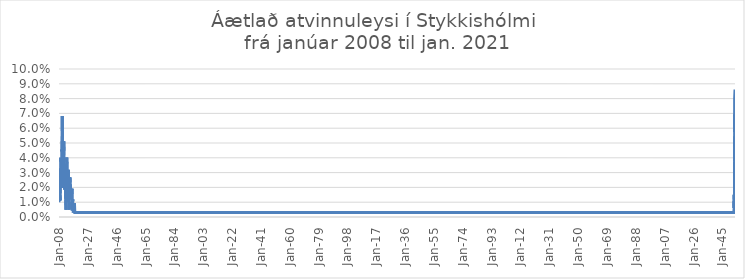
| Category | Áætlað atvinnuleysi |
|---|---|
| 2008-01-01 | 0.01 |
| 2008-02-01 | 0.015 |
| 2008-03-01 | 0.012 |
| 2008-04-01 | 0.013 |
| 2008-05-01 | 0.014 |
| 2008-06-01 | 0.011 |
| 2008-07-01 | 0.015 |
| 2008-08-01 | 0.015 |
| 2008-09-01 | 0.011 |
| 2008-10-01 | 0.012 |
| 2008-11-01 | 0.022 |
| 2008-12-01 | 0.03 |
| 2009-01-01 | 0.028 |
| 2009-02-01 | 0.033 |
| 2009-03-01 | 0.04 |
| 2009-04-01 | 0.037 |
| 2009-05-01 | 0.034 |
| 2009-06-01 | 0.032 |
| 2009-07-01 | 0.026 |
| 2009-08-01 | 0.024 |
| 2009-09-01 | 0.023 |
| 2009-10-01 | 0.035 |
| 2009-11-01 | 0.046 |
| 2009-12-01 | 0.046 |
| 2010-01-01 | 0.044 |
| 2010-02-01 | 0.055 |
| 2010-03-01 | 0.068 |
| 2010-04-01 | 0.054 |
| 2010-05-01 | 0.037 |
| 2010-06-01 | 0.02 |
| 2010-07-01 | 0.023 |
| 2010-08-01 | 0.026 |
| 2010-09-01 | 0.03 |
| 2010-10-01 | 0.025 |
| 2010-11-01 | 0.03 |
| 2010-12-01 | 0.027 |
| 2011-01-01 | 0.041 |
| 2011-02-01 | 0.043 |
| 2011-03-01 | 0.051 |
| 2011-04-01 | 0.045 |
| 2011-05-01 | 0.028 |
| 2011-06-01 | 0.033 |
| 2011-07-01 | 0.035 |
| 2011-08-01 | 0.032 |
| 2011-09-01 | 0.019 |
| 2011-10-01 | 0.033 |
| 2011-11-01 | 0.03 |
| 2011-12-01 | 0.03 |
| 2012-01-01 | 0.024 |
| 2012-02-01 | 0.026 |
| 2012-03-01 | 0.027 |
| 2012-04-01 | 0.025 |
| 2012-05-01 | 0.013 |
| 2012-06-01 | 0.011 |
| 2012-07-01 | 0.01 |
| 2012-08-01 | 0.005 |
| 2012-09-01 | 0.011 |
| 2012-10-01 | 0.02 |
| 2012-11-01 | 0.027 |
| 2012-12-01 | 0.03 |
| 2013-01-01 | 0.035 |
| 2013-02-01 | 0.039 |
| 2013-03-01 | 0.04 |
| 2013-04-01 | 0.03 |
| 2013-05-01 | 0.017 |
| 2013-06-01 | 0.016 |
| 2013-07-01 | 0.02 |
| 2013-08-01 | 0.017 |
| 2013-09-01 | 0.013 |
| 2013-10-01 | 0.01 |
| 2013-11-01 | 0.01 |
| 2013-12-01 | 0.016 |
| 2014-01-01 | 0.023 |
| 2014-02-01 | 0.025 |
| 2014-03-01 | 0.032 |
| 2014-04-01 | 0.03 |
| 2014-05-01 | 0.018 |
| 2014-06-01 | 0.012 |
| 2014-07-01 | 0.01 |
| 2014-08-01 | 0.007 |
| 2014-09-01 | 0.005 |
| 2014-10-01 | 0.01 |
| 2014-11-01 | 0.012 |
| 2014-12-01 | 0.018 |
| 2015-01-01 | 0.025 |
| 2015-02-01 | 0.023 |
| 2015-03-01 | 0.027 |
| 2015-04-01 | 0.02 |
| 2015-05-01 | 0.016 |
| 2015-06-01 | 0.02 |
| 2015-07-01 | 0.022 |
| 2015-08-01 | 0.02 |
| 2015-09-01 | 0.014 |
| 2015-10-01 | 0.014 |
| 2015-11-01 | 0.016 |
| 2015-12-01 | 0.018 |
| 2016-01-01 | 0.014 |
| 2016-02-01 | 0.019 |
| 2016-03-01 | 0.017 |
| 2016-04-01 | 0.017 |
| 2016-05-01 | 0.017 |
| 2016-06-01 | 0.016 |
| 2016-07-01 | 0.019 |
| 2016-08-01 | 0.012 |
| 2016-09-01 | 0.004 |
| 2016-10-01 | 0.006 |
| 2016-11-01 | 0.01 |
| 2016-12-01 | 0.009 |
| 2017-01-01 | 0.012 |
| 2017-02-01 | 0.01 |
| 2017-03-01 | 0.007 |
| 2017-04-01 | 0.007 |
| 2017-05-01 | 0.007 |
| 2017-06-01 | 0.003 |
| 2017-07-01 | 0.003 |
| 2017-08-01 | 0.003 |
| 2017-09-01 | 0.003 |
| 2017-10-01 | 0.005 |
| 2017-11-01 | 0.008 |
| 2017-12-01 | 0.006 |
| 2018-01-01 | 0.006 |
| 2018-02-01 | 0.008 |
| 2018-03-01 | 0.009 |
| 2018-04-01 | 0.008 |
| 2018-05-01 | 0.008 |
| 2018-06-01 | 0.003 |
| 2018-07-01 | 0.003 |
| 201808.0 | 0.003 |
| 201809.0 | 0.003 |
| 201810.0 | 0.003 |
| 201811.0 | 0.003 |
| 201812.0 | 0.003 |
| 201901.0 | 0.006 |
| 201902.0 | 0.008 |
| 201903.0 | 0.009 |
| 201904.0 | 0.015 |
| 201905.0 | 0.012 |
| 201906.0 | 0.006 |
| 201907.0 | 0.011 |
| 201908.0 | 0.008 |
| 201909.0 | 0.008 |
| 201910.0 | 0.006 |
| 201911.0 | 0.009 |
| 201912.0 | 0.011 |
| 202001.0 | 0.02 |
| 202002.0 | 0.019 |
| 202003.0 | 0.037 |
| 202004.0 | 0.046 |
| 202005.0 | 0.049 |
| 202006.0 | 0.039 |
| 202007.0 | 0.038 |
| 202008.0 | 0.055 |
| 202009.0 | 0.062 |
| 202010.0 | 0.057 |
| 202011.0 | 0.069 |
| 202012.0 | 0.08 |
| 202101.0 | 0.086 |